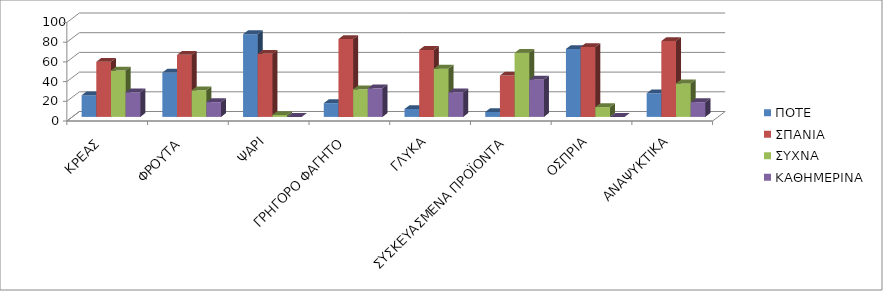
| Category | ΠΟΤΕ | ΣΠΑΝΙΑ | ΣΥΧΝΑ | ΚΑΘΗΜΕΡΙΝΑ |
|---|---|---|---|---|
| ΚΡΕΑΣ  | 22 | 56 | 47 | 25 |
| ΦΡΟΥΤΑ  | 45 | 63 | 27 | 15 |
| ΨΑΡΙ | 84 | 64 | 2 | 0 |
| ΓΡΗΓΟΡΟ ΦΑΓΗΤΟ | 14 | 79 | 28 | 29 |
| ΓΛΥΚΑ | 8 | 68 | 49 | 25 |
| ΣΥΣΚΕΥΑΣΜΕΝΑ ΠΡΟΪΟΝΤΑ  | 5 | 42 | 65 | 38 |
| ΟΣΠΡΙΑ | 69 | 71 | 10 | 0 |
| ΑΝΑΨΥΚΤΙΚΑ | 24 | 77 | 34 | 15 |